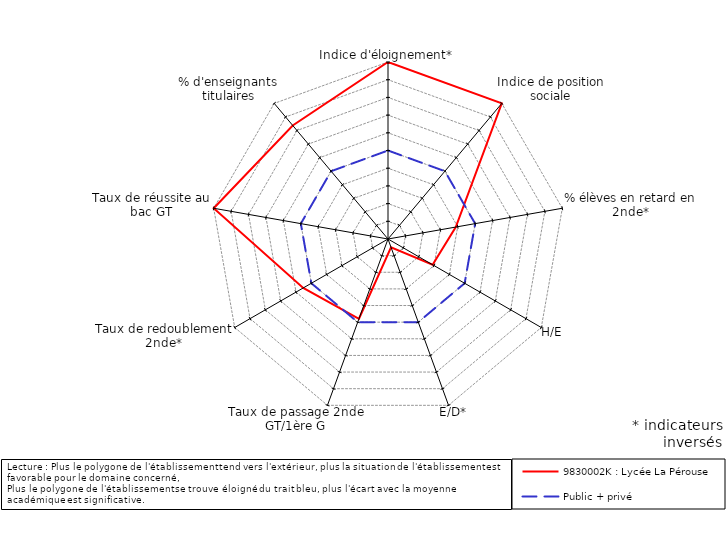
| Category | 9830002K : Lycée La Pérouse | Public + privé |
|---|---|---|
| Indice d'éloignement* | 5 | 0 |
| Indice de position sociale | 5 | 0 |
| % élèves en retard en 2nde* | -1.111 | 0 |
| H/E | -2.09 | 0 |
| E/D* | -4.5 | 0 |
| Taux de passage 2nde GT/1ère G | -0.204 | 0 |
| Taux de redoublement 2nde* | 0.53 | 0 |
| Taux de réussite au bac GT | 5 | 0 |
| % d'enseignants titulaires | 3.375 | 0 |